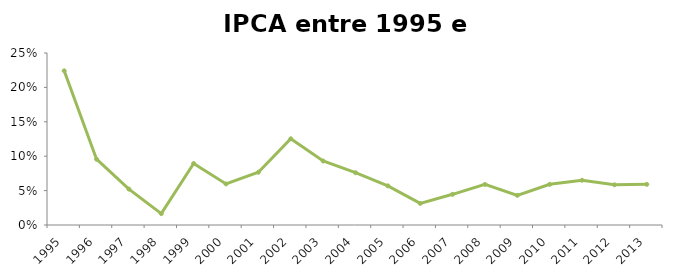
| Category | IPCA |
|---|---|
| 1995.0 | 0.224 |
| 1996.0 | 0.096 |
| 1997.0 | 0.052 |
| 1998.0 | 0.016 |
| 1999.0 | 0.089 |
| 2000.0 | 0.06 |
| 2001.0 | 0.077 |
| 2002.0 | 0.125 |
| 2003.0 | 0.093 |
| 2004.0 | 0.076 |
| 2005.0 | 0.057 |
| 2006.0 | 0.031 |
| 2007.0 | 0.045 |
| 2008.0 | 0.059 |
| 2009.0 | 0.043 |
| 2010.0 | 0.059 |
| 2011.0 | 0.065 |
| 2012.0 | 0.058 |
| 2013.0 | 0.059 |